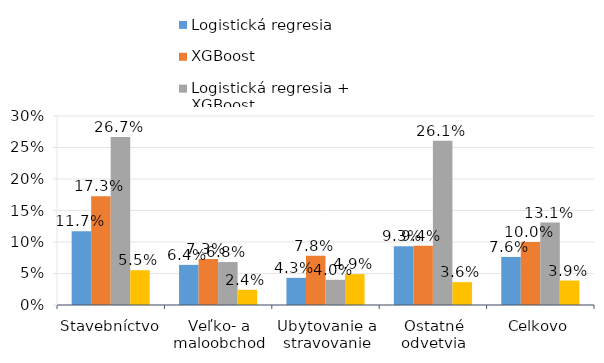
| Category | Logistická regresia | XGBoost | Logistická regresia + XGBoost | Inšpektoráty práce |
|---|---|---|---|---|
| Stavebníctvo | 0.117 | 0.173 | 0.267 | 0.055 |
| Veľko- a maloobchod | 0.064 | 0.073 | 0.068 | 0.024 |
| Ubytovanie a stravovanie | 0.043 | 0.078 | 0.04 | 0.049 |
| Ostatné odvetvia | 0.093 | 0.094 | 0.261 | 0.036 |
| Celkovo | 0.076 | 0.1 | 0.131 | 0.039 |